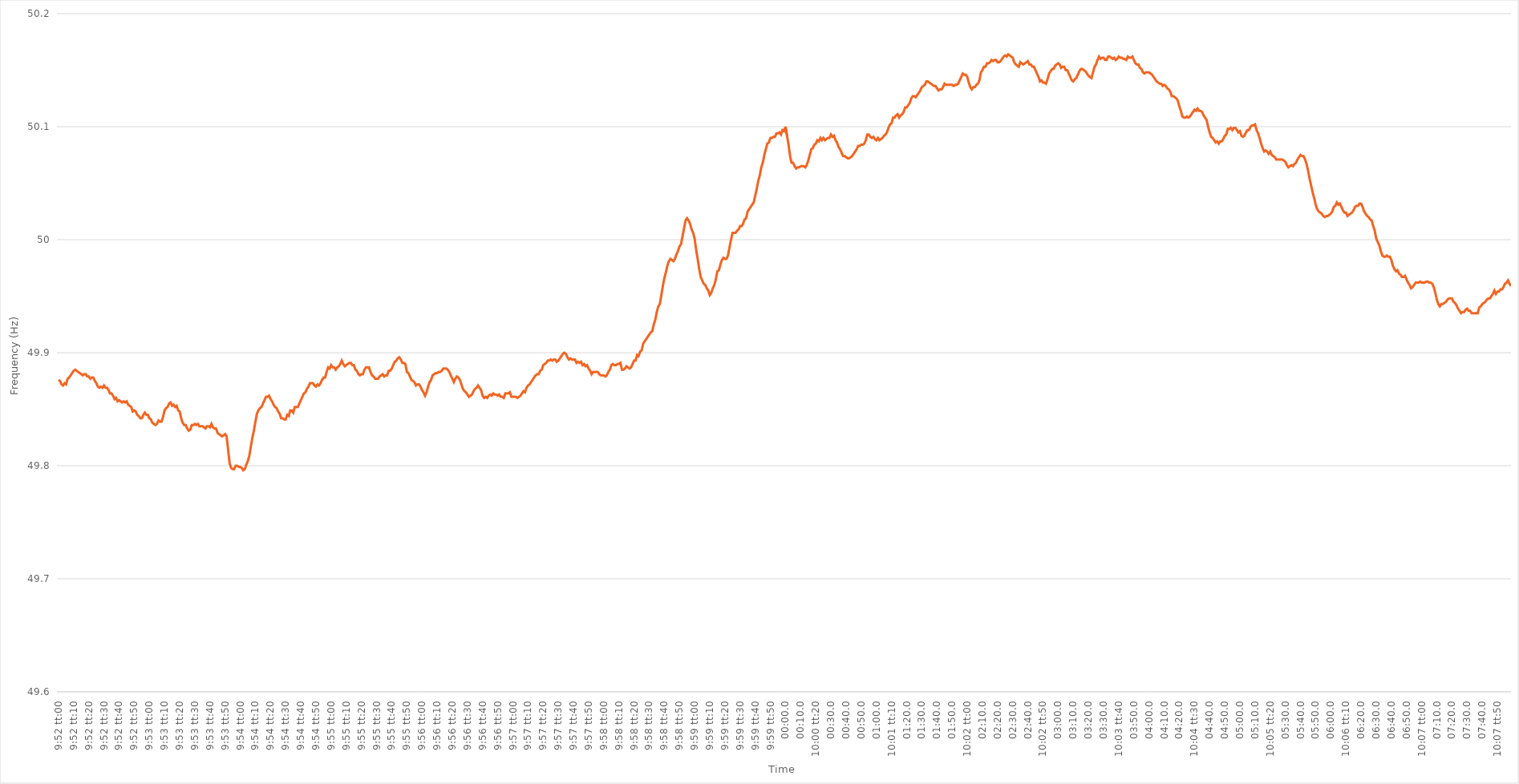
| Category | Series 0 |
|---|---|
| 0.41111111111111115 | 49.876 |
| 0.4111226851851852 | 49.875 |
| 0.4111342592592593 | 49.872 |
| 0.4111458333333333 | 49.871 |
| 0.4111574074074074 | 49.873 |
| 0.41116898148148145 | 49.872 |
| 0.4111805555555556 | 49.877 |
| 0.41119212962962964 | 49.878 |
| 0.41120370370370374 | 49.88 |
| 0.4112152777777778 | 49.882 |
| 0.4112268518518518 | 49.884 |
| 0.4112384259259259 | 49.885 |
| 0.41124999999999995 | 49.884 |
| 0.4112615740740741 | 49.883 |
| 0.41127314814814814 | 49.882 |
| 0.41128472222222223 | 49.881 |
| 0.41129629629629627 | 49.88 |
| 0.41130787037037037 | 49.881 |
| 0.4113194444444444 | 49.881 |
| 0.41133101851851855 | 49.879 |
| 0.4113425925925926 | 49.879 |
| 0.4113541666666667 | 49.877 |
| 0.4113657407407407 | 49.878 |
| 0.4113773148148148 | 49.878 |
| 0.41138888888888886 | 49.875 |
| 0.411400462962963 | 49.873 |
| 0.41141203703703705 | 49.87 |
| 0.41142361111111114 | 49.869 |
| 0.4114351851851852 | 49.87 |
| 0.4114467592592593 | 49.869 |
| 0.4114583333333333 | 49.871 |
| 0.41146990740740735 | 49.869 |
| 0.4114814814814815 | 49.869 |
| 0.41149305555555554 | 49.867 |
| 0.41150462962962964 | 49.864 |
| 0.4115162037037037 | 49.864 |
| 0.41152777777777777 | 49.862 |
| 0.4115393518518518 | 49.859 |
| 0.41155092592592596 | 49.86 |
| 0.4115625 | 49.857 |
| 0.4115740740740741 | 49.858 |
| 0.41158564814814813 | 49.857 |
| 0.4115972222222222 | 49.856 |
| 0.41160879629629626 | 49.857 |
| 0.4116203703703704 | 49.856 |
| 0.41163194444444445 | 49.857 |
| 0.41164351851851855 | 49.854 |
| 0.4116550925925926 | 49.853 |
| 0.4116666666666667 | 49.852 |
| 0.4116782407407407 | 49.848 |
| 0.41168981481481487 | 49.849 |
| 0.4117013888888889 | 49.848 |
| 0.41171296296296295 | 49.845 |
| 0.41172453703703704 | 49.844 |
| 0.4117361111111111 | 49.842 |
| 0.4117476851851852 | 49.842 |
| 0.4117592592592592 | 49.845 |
| 0.41177083333333336 | 49.847 |
| 0.4117824074074074 | 49.845 |
| 0.4117939814814815 | 49.845 |
| 0.41180555555555554 | 49.842 |
| 0.41181712962962963 | 49.841 |
| 0.41182870370370367 | 49.838 |
| 0.4118402777777778 | 49.837 |
| 0.41185185185185186 | 49.836 |
| 0.41186342592592595 | 49.837 |
| 0.411875 | 49.84 |
| 0.4118865740740741 | 49.839 |
| 0.4118981481481481 | 49.839 |
| 0.4119097222222223 | 49.843 |
| 0.4119212962962963 | 49.849 |
| 0.41193287037037035 | 49.851 |
| 0.41194444444444445 | 49.852 |
| 0.4119560185185185 | 49.855 |
| 0.4119675925925926 | 49.856 |
| 0.4119791666666666 | 49.853 |
| 0.41199074074074077 | 49.854 |
| 0.4120023148148148 | 49.852 |
| 0.4120138888888889 | 49.853 |
| 0.41202546296296294 | 49.849 |
| 0.41203703703703703 | 49.848 |
| 0.4120486111111111 | 49.842 |
| 0.4120601851851852 | 49.838 |
| 0.41207175925925926 | 49.836 |
| 0.41208333333333336 | 49.836 |
| 0.4120949074074074 | 49.833 |
| 0.4121064814814815 | 49.831 |
| 0.41211805555555553 | 49.832 |
| 0.4121296296296297 | 49.836 |
| 0.4121412037037037 | 49.836 |
| 0.4121527777777778 | 49.837 |
| 0.41216435185185185 | 49.836 |
| 0.4121759259259259 | 49.837 |
| 0.4121875 | 49.835 |
| 0.412199074074074 | 49.835 |
| 0.4122106481481482 | 49.835 |
| 0.4122222222222222 | 49.834 |
| 0.4122337962962963 | 49.833 |
| 0.41224537037037035 | 49.835 |
| 0.41225694444444444 | 49.835 |
| 0.4122685185185185 | 49.834 |
| 0.41228009259259263 | 49.837 |
| 0.41229166666666667 | 49.834 |
| 0.41230324074074076 | 49.833 |
| 0.4123148148148148 | 49.833 |
| 0.4123263888888889 | 49.829 |
| 0.41233796296296293 | 49.828 |
| 0.4123495370370371 | 49.827 |
| 0.4123611111111111 | 49.826 |
| 0.4123726851851852 | 49.827 |
| 0.41238425925925926 | 49.828 |
| 0.41239583333333335 | 49.826 |
| 0.4124074074074074 | 49.814 |
| 0.41241898148148143 | 49.802 |
| 0.4124305555555556 | 49.798 |
| 0.4124421296296296 | 49.797 |
| 0.4124537037037037 | 49.797 |
| 0.41246527777777775 | 49.8 |
| 0.41247685185185184 | 49.8 |
| 0.4124884259259259 | 49.799 |
| 0.41250000000000003 | 49.799 |
| 0.41251157407407407 | 49.798 |
| 0.41252314814814817 | 49.796 |
| 0.4125347222222222 | 49.797 |
| 0.4125462962962963 | 49.801 |
| 0.41255787037037034 | 49.804 |
| 0.4125694444444445 | 49.809 |
| 0.4125810185185185 | 49.817 |
| 0.4125925925925926 | 49.825 |
| 0.41260416666666666 | 49.831 |
| 0.41261574074074076 | 49.839 |
| 0.4126273148148148 | 49.846 |
| 0.41263888888888894 | 49.849 |
| 0.412650462962963 | 49.851 |
| 0.412662037037037 | 49.852 |
| 0.4126736111111111 | 49.855 |
| 0.41268518518518515 | 49.858 |
| 0.41269675925925925 | 49.861 |
| 0.4127083333333333 | 49.861 |
| 0.41271990740740744 | 49.862 |
| 0.4127314814814815 | 49.859 |
| 0.41274305555555557 | 49.857 |
| 0.4127546296296296 | 49.854 |
| 0.4127662037037037 | 49.852 |
| 0.41277777777777774 | 49.851 |
| 0.4127893518518519 | 49.848 |
| 0.41280092592592593 | 49.846 |
| 0.4128125 | 49.842 |
| 0.41282407407407407 | 49.842 |
| 0.41283564814814816 | 49.841 |
| 0.4128472222222222 | 49.841 |
| 0.41285879629629635 | 49.845 |
| 0.4128703703703704 | 49.844 |
| 0.4128819444444444 | 49.849 |
| 0.4128935185185185 | 49.849 |
| 0.41290509259259256 | 49.847 |
| 0.41291666666666665 | 49.852 |
| 0.4129282407407407 | 49.852 |
| 0.41293981481481484 | 49.852 |
| 0.4129513888888889 | 49.855 |
| 0.412962962962963 | 49.858 |
| 0.412974537037037 | 49.861 |
| 0.4129861111111111 | 49.864 |
| 0.41299768518518515 | 49.865 |
| 0.4130092592592593 | 49.868 |
| 0.41302083333333334 | 49.87 |
| 0.41303240740740743 | 49.873 |
| 0.41304398148148147 | 49.873 |
| 0.41305555555555556 | 49.873 |
| 0.4130671296296296 | 49.871 |
| 0.41307870370370375 | 49.87 |
| 0.4130902777777778 | 49.872 |
| 0.4131018518518519 | 49.871 |
| 0.4131134259259259 | 49.873 |
| 0.41312499999999996 | 49.876 |
| 0.41313657407407406 | 49.878 |
| 0.4131481481481481 | 49.878 |
| 0.41315972222222225 | 49.883 |
| 0.4131712962962963 | 49.887 |
| 0.4131828703703704 | 49.886 |
| 0.4131944444444444 | 49.889 |
| 0.4132060185185185 | 49.887 |
| 0.41321759259259255 | 49.887 |
| 0.4132291666666667 | 49.885 |
| 0.41324074074074074 | 49.887 |
| 0.41325231481481484 | 49.888 |
| 0.4132638888888889 | 49.89 |
| 0.41327546296296297 | 49.893 |
| 0.413287037037037 | 49.89 |
| 0.41329861111111116 | 49.888 |
| 0.4133101851851852 | 49.889 |
| 0.4133217592592593 | 49.89 |
| 0.41333333333333333 | 49.891 |
| 0.4133449074074074 | 49.891 |
| 0.41335648148148146 | 49.889 |
| 0.4133680555555555 | 49.889 |
| 0.41337962962962965 | 49.885 |
| 0.4133912037037037 | 49.884 |
| 0.4134027777777778 | 49.881 |
| 0.4134143518518518 | 49.88 |
| 0.4134259259259259 | 49.881 |
| 0.41343749999999996 | 49.881 |
| 0.4134490740740741 | 49.885 |
| 0.41346064814814815 | 49.887 |
| 0.41347222222222224 | 49.887 |
| 0.4134837962962963 | 49.887 |
| 0.4134953703703704 | 49.883 |
| 0.4135069444444444 | 49.88 |
| 0.41351851851851856 | 49.879 |
| 0.4135300925925926 | 49.877 |
| 0.4135416666666667 | 49.877 |
| 0.41355324074074074 | 49.877 |
| 0.41356481481481483 | 49.879 |
| 0.41357638888888887 | 49.88 |
| 0.413587962962963 | 49.881 |
| 0.41359953703703706 | 49.879 |
| 0.4136111111111111 | 49.88 |
| 0.4136226851851852 | 49.88 |
| 0.41363425925925923 | 49.884 |
| 0.4136458333333333 | 49.884 |
| 0.41365740740740736 | 49.886 |
| 0.4136689814814815 | 49.889 |
| 0.41368055555555555 | 49.892 |
| 0.41369212962962965 | 49.893 |
| 0.4137037037037037 | 49.895 |
| 0.4137152777777778 | 49.896 |
| 0.4137268518518518 | 49.894 |
| 0.41373842592592597 | 49.891 |
| 0.41375 | 49.891 |
| 0.4137615740740741 | 49.89 |
| 0.41377314814814814 | 49.883 |
| 0.41378472222222223 | 49.882 |
| 0.4137962962962963 | 49.879 |
| 0.4138078703703704 | 49.876 |
| 0.41381944444444446 | 49.875 |
| 0.4138310185185185 | 49.874 |
| 0.4138425925925926 | 49.871 |
| 0.41385416666666663 | 49.872 |
| 0.41386574074074073 | 49.872 |
| 0.41387731481481477 | 49.87 |
| 0.4138888888888889 | 49.867 |
| 0.41390046296296296 | 49.865 |
| 0.41391203703703705 | 49.862 |
| 0.4139236111111111 | 49.865 |
| 0.4139351851851852 | 49.87 |
| 0.4139467592592592 | 49.874 |
| 0.4139583333333334 | 49.876 |
| 0.4139699074074074 | 49.88 |
| 0.4139814814814815 | 49.881 |
| 0.41399305555555554 | 49.882 |
| 0.41400462962962964 | 49.882 |
| 0.4140162037037037 | 49.883 |
| 0.41402777777777783 | 49.883 |
| 0.41403935185185187 | 49.884 |
| 0.41405092592592596 | 49.886 |
| 0.4140625 | 49.886 |
| 0.41407407407407404 | 49.886 |
| 0.41408564814814813 | 49.885 |
| 0.41409722222222217 | 49.883 |
| 0.4141087962962963 | 49.88 |
| 0.41412037037037036 | 49.877 |
| 0.41413194444444446 | 49.874 |
| 0.4141435185185185 | 49.877 |
| 0.4141550925925926 | 49.879 |
| 0.4141666666666666 | 49.878 |
| 0.4141782407407408 | 49.876 |
| 0.4141898148148148 | 49.872 |
| 0.4142013888888889 | 49.868 |
| 0.41421296296296295 | 49.866 |
| 0.41422453703703704 | 49.865 |
| 0.4142361111111111 | 49.863 |
| 0.41424768518518523 | 49.861 |
| 0.41425925925925927 | 49.862 |
| 0.41427083333333337 | 49.863 |
| 0.4142824074074074 | 49.866 |
| 0.4142939814814815 | 49.868 |
| 0.41430555555555554 | 49.869 |
| 0.4143171296296296 | 49.871 |
| 0.4143287037037037 | 49.869 |
| 0.41434027777777777 | 49.867 |
| 0.41435185185185186 | 49.862 |
| 0.4143634259259259 | 49.86 |
| 0.414375 | 49.861 |
| 0.41438657407407403 | 49.86 |
| 0.4143981481481482 | 49.862 |
| 0.4144097222222222 | 49.863 |
| 0.4144212962962963 | 49.862 |
| 0.41443287037037035 | 49.864 |
| 0.41444444444444445 | 49.863 |
| 0.4144560185185185 | 49.863 |
| 0.41446759259259264 | 49.862 |
| 0.4144791666666667 | 49.863 |
| 0.41449074074074077 | 49.861 |
| 0.4145023148148148 | 49.861 |
| 0.4145138888888889 | 49.86 |
| 0.41452546296296294 | 49.864 |
| 0.414537037037037 | 49.864 |
| 0.41454861111111113 | 49.864 |
| 0.41456018518518517 | 49.865 |
| 0.41457175925925926 | 49.861 |
| 0.4145833333333333 | 49.861 |
| 0.4145949074074074 | 49.861 |
| 0.41460648148148144 | 49.861 |
| 0.4146180555555556 | 49.86 |
| 0.4146296296296296 | 49.861 |
| 0.4146412037037037 | 49.862 |
| 0.41465277777777776 | 49.864 |
| 0.41466435185185185 | 49.866 |
| 0.4146759259259259 | 49.865 |
| 0.41468750000000004 | 49.869 |
| 0.4146990740740741 | 49.871 |
| 0.4147106481481482 | 49.872 |
| 0.4147222222222222 | 49.874 |
| 0.4147337962962963 | 49.876 |
| 0.41474537037037035 | 49.878 |
| 0.4147569444444445 | 49.88 |
| 0.41476851851851854 | 49.881 |
| 0.4147800925925926 | 49.881 |
| 0.41479166666666667 | 49.884 |
| 0.4148032407407407 | 49.885 |
| 0.4148148148148148 | 49.889 |
| 0.41482638888888884 | 49.89 |
| 0.414837962962963 | 49.891 |
| 0.41484953703703703 | 49.893 |
| 0.4148611111111111 | 49.893 |
| 0.41487268518518516 | 49.894 |
| 0.41488425925925926 | 49.893 |
| 0.4148958333333333 | 49.894 |
| 0.41490740740740745 | 49.894 |
| 0.4149189814814815 | 49.892 |
| 0.4149305555555556 | 49.893 |
| 0.4149421296296296 | 49.895 |
| 0.4149537037037037 | 49.897 |
| 0.41496527777777775 | 49.899 |
| 0.4149768518518519 | 49.9 |
| 0.41498842592592594 | 49.899 |
| 0.41500000000000004 | 49.896 |
| 0.4150115740740741 | 49.894 |
| 0.4150231481481481 | 49.895 |
| 0.4150347222222222 | 49.894 |
| 0.41504629629629625 | 49.894 |
| 0.4150578703703704 | 49.894 |
| 0.41506944444444444 | 49.891 |
| 0.41508101851851853 | 49.892 |
| 0.41509259259259257 | 49.891 |
| 0.41510416666666666 | 49.892 |
| 0.4151157407407407 | 49.889 |
| 0.41512731481481485 | 49.89 |
| 0.4151388888888889 | 49.888 |
| 0.415150462962963 | 49.889 |
| 0.415162037037037 | 49.886 |
| 0.4151736111111111 | 49.884 |
| 0.41518518518518516 | 49.881 |
| 0.4151967592592593 | 49.883 |
| 0.41520833333333335 | 49.883 |
| 0.41521990740740744 | 49.883 |
| 0.4152314814814815 | 49.883 |
| 0.4152430555555556 | 49.881 |
| 0.4152546296296296 | 49.88 |
| 0.41526620370370365 | 49.88 |
| 0.4152777777777778 | 49.88 |
| 0.41528935185185184 | 49.879 |
| 0.41530092592592593 | 49.88 |
| 0.4153125 | 49.883 |
| 0.41532407407407407 | 49.885 |
| 0.4153356481481481 | 49.889 |
| 0.41534722222222226 | 49.89 |
| 0.4153587962962963 | 49.889 |
| 0.4153703703703704 | 49.889 |
| 0.41538194444444443 | 49.89 |
| 0.4153935185185185 | 49.89 |
| 0.41540509259259256 | 49.891 |
| 0.4154166666666667 | 49.885 |
| 0.41542824074074075 | 49.885 |
| 0.41543981481481485 | 49.886 |
| 0.4154513888888889 | 49.888 |
| 0.415462962962963 | 49.887 |
| 0.415474537037037 | 49.886 |
| 0.41548611111111106 | 49.887 |
| 0.4154976851851852 | 49.89 |
| 0.41550925925925924 | 49.893 |
| 0.41552083333333334 | 49.893 |
| 0.4155324074074074 | 49.898 |
| 0.4155439814814815 | 49.897 |
| 0.4155555555555555 | 49.901 |
| 0.41556712962962966 | 49.902 |
| 0.4155787037037037 | 49.908 |
| 0.4155902777777778 | 49.91 |
| 0.41560185185185183 | 49.912 |
| 0.41561342592592593 | 49.914 |
| 0.41562499999999997 | 49.916 |
| 0.4156365740740741 | 49.918 |
| 0.41564814814814816 | 49.919 |
| 0.41565972222222225 | 49.925 |
| 0.4156712962962963 | 49.929 |
| 0.4156828703703704 | 49.936 |
| 0.4156944444444444 | 49.941 |
| 0.41570601851851857 | 49.943 |
| 0.4157175925925926 | 49.951 |
| 0.41572916666666665 | 49.959 |
| 0.41574074074074074 | 49.966 |
| 0.4157523148148148 | 49.971 |
| 0.4157638888888889 | 49.977 |
| 0.4157754629629629 | 49.981 |
| 0.41578703703703707 | 49.983 |
| 0.4157986111111111 | 49.982 |
| 0.4158101851851852 | 49.981 |
| 0.41582175925925924 | 49.983 |
| 0.41583333333333333 | 49.987 |
| 0.41584490740740737 | 49.99 |
| 0.4158564814814815 | 49.994 |
| 0.41586805555555556 | 49.996 |
| 0.41587962962962965 | 50.003 |
| 0.4158912037037037 | 50.01 |
| 0.4159027777777778 | 50.017 |
| 0.4159143518518518 | 50.019 |
| 0.415925925925926 | 50.017 |
| 0.4159375 | 50.014 |
| 0.4159490740740741 | 50.009 |
| 0.41596064814814815 | 50.006 |
| 0.4159722222222222 | 50.001 |
| 0.4159837962962963 | 49.991 |
| 0.4159953703703703 | 49.983 |
| 0.41600694444444447 | 49.974 |
| 0.4160185185185185 | 49.967 |
| 0.4160300925925926 | 49.964 |
| 0.41604166666666664 | 49.961 |
| 0.41605324074074074 | 49.96 |
| 0.4160648148148148 | 49.957 |
| 0.4160763888888889 | 49.955 |
| 0.41608796296296297 | 49.951 |
| 0.41609953703703706 | 49.953 |
| 0.4161111111111111 | 49.957 |
| 0.4161226851851852 | 49.96 |
| 0.41613425925925923 | 49.965 |
| 0.4161458333333334 | 49.972 |
| 0.4161574074074074 | 49.973 |
| 0.4161689814814815 | 49.978 |
| 0.41618055555555555 | 49.982 |
| 0.41619212962962965 | 49.984 |
| 0.4162037037037037 | 49.983 |
| 0.4162152777777777 | 49.983 |
| 0.4162268518518519 | 49.986 |
| 0.4162384259259259 | 49.993 |
| 0.41625 | 50 |
| 0.41626157407407405 | 50.006 |
| 0.41627314814814814 | 50.006 |
| 0.4162847222222222 | 50.006 |
| 0.41629629629629633 | 50.008 |
| 0.41630787037037037 | 50.009 |
| 0.41631944444444446 | 50.012 |
| 0.4163310185185185 | 50.012 |
| 0.4163425925925926 | 50.014 |
| 0.41635416666666664 | 50.018 |
| 0.4163657407407408 | 50.019 |
| 0.4163773148148148 | 50.025 |
| 0.4163888888888889 | 50.027 |
| 0.41640046296296296 | 50.029 |
| 0.41641203703703705 | 50.031 |
| 0.4164236111111111 | 50.033 |
| 0.41643518518518513 | 50.039 |
| 0.4164467592592593 | 50.045 |
| 0.4164583333333333 | 50.052 |
| 0.4164699074074074 | 50.057 |
| 0.41648148148148145 | 50.064 |
| 0.41649305555555555 | 50.068 |
| 0.4165046296296296 | 50.075 |
| 0.41651620370370374 | 50.08 |
| 0.4165277777777778 | 50.085 |
| 0.41653935185185187 | 50.086 |
| 0.4165509259259259 | 50.09 |
| 0.4165625 | 50.09 |
| 0.41657407407407404 | 50.091 |
| 0.4165856481481482 | 50.091 |
| 0.41659722222222223 | 50.094 |
| 0.4166087962962963 | 50.094 |
| 0.41662037037037036 | 50.095 |
| 0.41663194444444446 | 50.093 |
| 0.4166435185185185 | 50.097 |
| 0.41665509259259265 | 50.096 |
| 0.4166666666666667 | 50.1 |
| 0.4166782407407407 | 50.092 |
| 0.4166898148148148 | 50.084 |
| 0.41670138888888886 | 50.074 |
| 0.41671296296296295 | 50.068 |
| 0.416724537037037 | 50.068 |
| 0.41673611111111114 | 50.065 |
| 0.4167476851851852 | 50.063 |
| 0.4167592592592593 | 50.064 |
| 0.4167708333333333 | 50.064 |
| 0.4167824074074074 | 50.065 |
| 0.41679398148148145 | 50.065 |
| 0.4168055555555556 | 50.065 |
| 0.41681712962962963 | 50.064 |
| 0.41682870370370373 | 50.066 |
| 0.41684027777777777 | 50.07 |
| 0.41685185185185186 | 50.075 |
| 0.4168634259259259 | 50.08 |
| 0.41687500000000005 | 50.081 |
| 0.4168865740740741 | 50.084 |
| 0.4168981481481482 | 50.085 |
| 0.4169097222222222 | 50.088 |
| 0.41692129629629626 | 50.087 |
| 0.41693287037037036 | 50.09 |
| 0.4169444444444444 | 50.088 |
| 0.41695601851851855 | 50.09 |
| 0.4169675925925926 | 50.088 |
| 0.4169791666666667 | 50.089 |
| 0.4169907407407407 | 50.09 |
| 0.4170023148148148 | 50.09 |
| 0.41701388888888885 | 50.093 |
| 0.417025462962963 | 50.091 |
| 0.41703703703703704 | 50.092 |
| 0.41704861111111113 | 50.088 |
| 0.4170601851851852 | 50.086 |
| 0.41707175925925927 | 50.082 |
| 0.4170833333333333 | 50.08 |
| 0.41709490740740746 | 50.077 |
| 0.4171064814814815 | 50.074 |
| 0.4171180555555556 | 50.074 |
| 0.41712962962962963 | 50.073 |
| 0.41714120370370367 | 50.072 |
| 0.41715277777777776 | 50.072 |
| 0.4171643518518518 | 50.073 |
| 0.41717592592592595 | 50.074 |
| 0.4171875 | 50.076 |
| 0.4171990740740741 | 50.078 |
| 0.4172106481481481 | 50.08 |
| 0.4172222222222222 | 50.083 |
| 0.41723379629629626 | 50.083 |
| 0.4172453703703704 | 50.084 |
| 0.41725694444444444 | 50.084 |
| 0.41726851851851854 | 50.085 |
| 0.4172800925925926 | 50.088 |
| 0.41729166666666667 | 50.093 |
| 0.4173032407407407 | 50.093 |
| 0.41731481481481486 | 50.091 |
| 0.4173263888888889 | 50.09 |
| 0.417337962962963 | 50.091 |
| 0.41734953703703703 | 50.089 |
| 0.4173611111111111 | 50.088 |
| 0.41737268518518517 | 50.09 |
| 0.4173842592592592 | 50.088 |
| 0.41739583333333335 | 50.089 |
| 0.4174074074074074 | 50.09 |
| 0.4174189814814815 | 50.092 |
| 0.4174305555555555 | 50.093 |
| 0.4174421296296296 | 50.095 |
| 0.41745370370370366 | 50.099 |
| 0.4174652777777778 | 50.102 |
| 0.41747685185185185 | 50.103 |
| 0.41748842592592594 | 50.108 |
| 0.4175 | 50.108 |
| 0.4175115740740741 | 50.11 |
| 0.4175231481481481 | 50.111 |
| 0.41753472222222227 | 50.108 |
| 0.4175462962962963 | 50.11 |
| 0.4175578703703704 | 50.111 |
| 0.41756944444444444 | 50.113 |
| 0.41758101851851853 | 50.117 |
| 0.41759259259259257 | 50.117 |
| 0.4176041666666667 | 50.119 |
| 0.41761574074074076 | 50.121 |
| 0.4176273148148148 | 50.125 |
| 0.4176388888888889 | 50.127 |
| 0.41765046296296293 | 50.127 |
| 0.417662037037037 | 50.126 |
| 0.41767361111111106 | 50.128 |
| 0.4176851851851852 | 50.13 |
| 0.41769675925925925 | 50.132 |
| 0.41770833333333335 | 50.135 |
| 0.4177199074074074 | 50.136 |
| 0.4177314814814815 | 50.137 |
| 0.4177430555555555 | 50.14 |
| 0.41775462962962967 | 50.14 |
| 0.4177662037037037 | 50.139 |
| 0.4177777777777778 | 50.138 |
| 0.41778935185185184 | 50.137 |
| 0.41780092592592594 | 50.136 |
| 0.4178125 | 50.136 |
| 0.4178240740740741 | 50.134 |
| 0.41783564814814816 | 50.132 |
| 0.41784722222222226 | 50.133 |
| 0.4178587962962963 | 50.133 |
| 0.41787037037037034 | 50.135 |
| 0.41788194444444443 | 50.138 |
| 0.41789351851851847 | 50.137 |
| 0.4179050925925926 | 50.137 |
| 0.41791666666666666 | 50.137 |
| 0.41792824074074075 | 50.137 |
| 0.4179398148148148 | 50.137 |
| 0.4179513888888889 | 50.136 |
| 0.4179629629629629 | 50.137 |
| 0.4179745370370371 | 50.137 |
| 0.4179861111111111 | 50.138 |
| 0.4179976851851852 | 50.141 |
| 0.41800925925925925 | 50.144 |
| 0.41802083333333334 | 50.147 |
| 0.4180324074074074 | 50.146 |
| 0.41804398148148153 | 50.146 |
| 0.41805555555555557 | 50.144 |
| 0.41806712962962966 | 50.139 |
| 0.4180787037037037 | 50.135 |
| 0.41809027777777774 | 50.133 |
| 0.41810185185185184 | 50.135 |
| 0.4181134259259259 | 50.135 |
| 0.418125 | 50.137 |
| 0.41813657407407406 | 50.138 |
| 0.41814814814814816 | 50.141 |
| 0.4181597222222222 | 50.148 |
| 0.4181712962962963 | 50.15 |
| 0.41818287037037033 | 50.153 |
| 0.4181944444444445 | 50.153 |
| 0.4182060185185185 | 50.156 |
| 0.4182175925925926 | 50.156 |
| 0.41822916666666665 | 50.157 |
| 0.41824074074074075 | 50.159 |
| 0.4182523148148148 | 50.158 |
| 0.41826388888888894 | 50.159 |
| 0.418275462962963 | 50.159 |
| 0.41828703703703707 | 50.157 |
| 0.4182986111111111 | 50.157 |
| 0.4183101851851852 | 50.158 |
| 0.41832175925925924 | 50.16 |
| 0.4183333333333333 | 50.162 |
| 0.41834490740740743 | 50.163 |
| 0.41835648148148147 | 50.162 |
| 0.41836805555555556 | 50.164 |
| 0.4183796296296296 | 50.163 |
| 0.4183912037037037 | 50.162 |
| 0.41840277777777773 | 50.161 |
| 0.4184143518518519 | 50.157 |
| 0.4184259259259259 | 50.155 |
| 0.4184375 | 50.154 |
| 0.41844907407407406 | 50.153 |
| 0.41846064814814815 | 50.157 |
| 0.4184722222222222 | 50.156 |
| 0.41848379629629634 | 50.155 |
| 0.4184953703703704 | 50.156 |
| 0.4185069444444445 | 50.157 |
| 0.4185185185185185 | 50.158 |
| 0.4185300925925926 | 50.155 |
| 0.41854166666666665 | 50.155 |
| 0.4185532407407408 | 50.153 |
| 0.41856481481481483 | 50.153 |
| 0.4185763888888889 | 50.15 |
| 0.41858796296296297 | 50.147 |
| 0.418599537037037 | 50.144 |
| 0.4186111111111111 | 50.14 |
| 0.41862268518518514 | 50.141 |
| 0.4186342592592593 | 50.139 |
| 0.41864583333333333 | 50.139 |
| 0.4186574074074074 | 50.138 |
| 0.41866898148148146 | 50.142 |
| 0.41868055555555556 | 50.147 |
| 0.4186921296296296 | 50.149 |
| 0.41870370370370374 | 50.151 |
| 0.4187152777777778 | 50.151 |
| 0.4187268518518519 | 50.154 |
| 0.4187384259259259 | 50.155 |
| 0.41875 | 50.156 |
| 0.41876157407407405 | 50.155 |
| 0.4187731481481482 | 50.152 |
| 0.41878472222222224 | 50.153 |
| 0.41879629629629633 | 50.153 |
| 0.41880787037037037 | 50.15 |
| 0.4188194444444444 | 50.15 |
| 0.4188310185185185 | 50.147 |
| 0.41884259259259254 | 50.144 |
| 0.4188541666666667 | 50.141 |
| 0.41886574074074073 | 50.14 |
| 0.4188773148148148 | 50.142 |
| 0.41888888888888887 | 50.143 |
| 0.41890046296296296 | 50.146 |
| 0.418912037037037 | 50.149 |
| 0.41892361111111115 | 50.151 |
| 0.4189351851851852 | 50.151 |
| 0.4189467592592593 | 50.15 |
| 0.4189583333333333 | 50.149 |
| 0.4189699074074074 | 50.147 |
| 0.41898148148148145 | 50.145 |
| 0.4189930555555556 | 50.144 |
| 0.41900462962962964 | 50.143 |
| 0.41901620370370374 | 50.148 |
| 0.4190277777777778 | 50.153 |
| 0.4190393518518518 | 50.155 |
| 0.4190509259259259 | 50.159 |
| 0.41906249999999995 | 50.162 |
| 0.4190740740740741 | 50.16 |
| 0.41908564814814814 | 50.161 |
| 0.41909722222222223 | 50.161 |
| 0.41910879629629627 | 50.159 |
| 0.41912037037037037 | 50.159 |
| 0.4191319444444444 | 50.162 |
| 0.41914351851851855 | 50.162 |
| 0.4191550925925926 | 50.161 |
| 0.4191666666666667 | 50.16 |
| 0.4191782407407407 | 50.161 |
| 0.4191898148148148 | 50.159 |
| 0.41920138888888886 | 50.16 |
| 0.419212962962963 | 50.162 |
| 0.41922453703703705 | 50.161 |
| 0.41923611111111114 | 50.161 |
| 0.4192476851851852 | 50.16 |
| 0.4192592592592593 | 50.16 |
| 0.4192708333333333 | 50.159 |
| 0.41928240740740735 | 50.162 |
| 0.4192939814814815 | 50.161 |
| 0.41930555555555554 | 50.161 |
| 0.41931712962962964 | 50.162 |
| 0.4193287037037037 | 50.159 |
| 0.41934027777777777 | 50.156 |
| 0.4193518518518518 | 50.155 |
| 0.41936342592592596 | 50.155 |
| 0.419375 | 50.152 |
| 0.4193865740740741 | 50.151 |
| 0.41939814814814813 | 50.148 |
| 0.4194097222222222 | 50.147 |
| 0.41942129629629626 | 50.148 |
| 0.4194328703703704 | 50.148 |
| 0.41944444444444445 | 50.148 |
| 0.41945601851851855 | 50.147 |
| 0.4194675925925926 | 50.146 |
| 0.4194791666666667 | 50.144 |
| 0.4194907407407407 | 50.142 |
| 0.41950231481481487 | 50.14 |
| 0.4195138888888889 | 50.139 |
| 0.41952546296296295 | 50.138 |
| 0.41953703703703704 | 50.138 |
| 0.4195486111111111 | 50.136 |
| 0.4195601851851852 | 50.137 |
| 0.4195717592592592 | 50.136 |
| 0.41958333333333336 | 50.134 |
| 0.4195949074074074 | 50.133 |
| 0.4196064814814815 | 50.131 |
| 0.41961805555555554 | 50.127 |
| 0.41962962962962963 | 50.127 |
| 0.41964120370370367 | 50.126 |
| 0.4196527777777778 | 50.125 |
| 0.41966435185185186 | 50.123 |
| 0.41967592592592595 | 50.118 |
| 0.4196875 | 50.114 |
| 0.4196990740740741 | 50.109 |
| 0.4197106481481481 | 50.108 |
| 0.4197222222222223 | 50.108 |
| 0.4197337962962963 | 50.109 |
| 0.41974537037037035 | 50.108 |
| 0.41975694444444445 | 50.109 |
| 0.4197685185185185 | 50.111 |
| 0.4197800925925926 | 50.113 |
| 0.4197916666666666 | 50.115 |
| 0.41980324074074077 | 50.114 |
| 0.4198148148148148 | 50.116 |
| 0.4198263888888889 | 50.114 |
| 0.41983796296296294 | 50.114 |
| 0.41984953703703703 | 50.113 |
| 0.4198611111111111 | 50.11 |
| 0.4198726851851852 | 50.108 |
| 0.41988425925925926 | 50.106 |
| 0.41989583333333336 | 50.1 |
| 0.4199074074074074 | 50.095 |
| 0.4199189814814815 | 50.091 |
| 0.41993055555555553 | 50.09 |
| 0.4199421296296297 | 50.088 |
| 0.4199537037037037 | 50.086 |
| 0.4199652777777778 | 50.087 |
| 0.41997685185185185 | 50.085 |
| 0.4199884259259259 | 50.087 |
| 0.42 | 50.087 |
| 0.420011574074074 | 50.089 |
| 0.4200231481481482 | 50.092 |
| 0.4200347222222222 | 50.093 |
| 0.4200462962962963 | 50.098 |
| 0.42005787037037035 | 50.098 |
| 0.42006944444444444 | 50.099 |
| 0.4200810185185185 | 50.097 |
| 0.42009259259259263 | 50.099 |
| 0.42010416666666667 | 50.099 |
| 0.42011574074074076 | 50.097 |
| 0.4201273148148148 | 50.095 |
| 0.4201388888888889 | 50.096 |
| 0.42015046296296293 | 50.092 |
| 0.4201620370370371 | 50.091 |
| 0.4201736111111111 | 50.092 |
| 0.4201851851851852 | 50.095 |
| 0.42019675925925926 | 50.097 |
| 0.42020833333333335 | 50.097 |
| 0.4202199074074074 | 50.1 |
| 0.42023148148148143 | 50.101 |
| 0.4202430555555556 | 50.101 |
| 0.4202546296296296 | 50.102 |
| 0.4202662037037037 | 50.097 |
| 0.42027777777777775 | 50.094 |
| 0.42028935185185184 | 50.09 |
| 0.4203009259259259 | 50.085 |
| 0.42031250000000003 | 50.081 |
| 0.42032407407407407 | 50.078 |
| 0.42033564814814817 | 50.079 |
| 0.4203472222222222 | 50.078 |
| 0.4203587962962963 | 50.076 |
| 0.42037037037037034 | 50.078 |
| 0.4203819444444445 | 50.075 |
| 0.4203935185185185 | 50.074 |
| 0.4204050925925926 | 50.073 |
| 0.42041666666666666 | 50.071 |
| 0.42042824074074076 | 50.071 |
| 0.4204398148148148 | 50.071 |
| 0.42045138888888894 | 50.071 |
| 0.420462962962963 | 50.071 |
| 0.420474537037037 | 50.07 |
| 0.4204861111111111 | 50.069 |
| 0.42049768518518515 | 50.066 |
| 0.42050925925925925 | 50.064 |
| 0.4205208333333333 | 50.065 |
| 0.42053240740740744 | 50.066 |
| 0.4205439814814815 | 50.065 |
| 0.42055555555555557 | 50.067 |
| 0.4205671296296296 | 50.068 |
| 0.4205787037037037 | 50.071 |
| 0.42059027777777774 | 50.073 |
| 0.4206018518518519 | 50.075 |
| 0.42061342592592593 | 50.074 |
| 0.420625 | 50.074 |
| 0.42063657407407407 | 50.071 |
| 0.42064814814814816 | 50.067 |
| 0.4206597222222222 | 50.061 |
| 0.42067129629629635 | 50.054 |
| 0.4206828703703704 | 50.048 |
| 0.4206944444444444 | 50.042 |
| 0.4207060185185185 | 50.037 |
| 0.42071759259259256 | 50.031 |
| 0.42072916666666665 | 50.027 |
| 0.4207407407407407 | 50.025 |
| 0.42075231481481484 | 50.024 |
| 0.4207638888888889 | 50.023 |
| 0.420775462962963 | 50.021 |
| 0.420787037037037 | 50.02 |
| 0.4207986111111111 | 50.021 |
| 0.42081018518518515 | 50.021 |
| 0.4208217592592593 | 50.022 |
| 0.42083333333333334 | 50.023 |
| 0.42084490740740743 | 50.025 |
| 0.42085648148148147 | 50.029 |
| 0.42086805555555556 | 50.03 |
| 0.4208796296296296 | 50.033 |
| 0.42089120370370375 | 50.031 |
| 0.4209027777777778 | 50.032 |
| 0.4209143518518519 | 50.029 |
| 0.4209259259259259 | 50.026 |
| 0.42093749999999996 | 50.024 |
| 0.42094907407407406 | 50.024 |
| 0.4209606481481481 | 50.021 |
| 0.42097222222222225 | 50.022 |
| 0.4209837962962963 | 50.023 |
| 0.4209953703703704 | 50.024 |
| 0.4210069444444444 | 50.026 |
| 0.4210185185185185 | 50.029 |
| 0.42103009259259255 | 50.03 |
| 0.4210416666666667 | 50.03 |
| 0.42105324074074074 | 50.032 |
| 0.42106481481481484 | 50.032 |
| 0.4210763888888889 | 50.029 |
| 0.42108796296296297 | 50.025 |
| 0.421099537037037 | 50.023 |
| 0.42111111111111116 | 50.021 |
| 0.4211226851851852 | 50.02 |
| 0.4211342592592593 | 50.018 |
| 0.42114583333333333 | 50.017 |
| 0.4211574074074074 | 50.012 |
| 0.42116898148148146 | 50.008 |
| 0.4211805555555555 | 50.001 |
| 0.42119212962962965 | 49.998 |
| 0.4212037037037037 | 49.995 |
| 0.4212152777777778 | 49.99 |
| 0.4212268518518518 | 49.986 |
| 0.4212384259259259 | 49.985 |
| 0.42124999999999996 | 49.985 |
| 0.4212615740740741 | 49.986 |
| 0.42127314814814815 | 49.985 |
| 0.42128472222222224 | 49.985 |
| 0.4212962962962963 | 49.982 |
| 0.4213078703703704 | 49.977 |
| 0.4213194444444444 | 49.974 |
| 0.42133101851851856 | 49.972 |
| 0.4213425925925926 | 49.973 |
| 0.4213541666666667 | 49.97 |
| 0.42136574074074074 | 49.969 |
| 0.42137731481481483 | 49.967 |
| 0.42138888888888887 | 49.967 |
| 0.421400462962963 | 49.968 |
| 0.42141203703703706 | 49.965 |
| 0.4214236111111111 | 49.962 |
| 0.4214351851851852 | 49.96 |
| 0.42144675925925923 | 49.957 |
| 0.4214583333333333 | 49.958 |
| 0.42146990740740736 | 49.96 |
| 0.4214814814814815 | 49.962 |
| 0.42149305555555555 | 49.962 |
| 0.42150462962962965 | 49.962 |
| 0.4215162037037037 | 49.963 |
| 0.4215277777777778 | 49.962 |
| 0.4215393518518518 | 49.962 |
| 0.42155092592592597 | 49.962 |
| 0.4215625 | 49.963 |
| 0.4215740740740741 | 49.963 |
| 0.42158564814814814 | 49.962 |
| 0.42159722222222223 | 49.962 |
| 0.4216087962962963 | 49.961 |
| 0.4216203703703704 | 49.958 |
| 0.42163194444444446 | 49.953 |
| 0.4216435185185185 | 49.947 |
| 0.4216550925925926 | 49.943 |
| 0.42166666666666663 | 49.941 |
| 0.42167824074074073 | 49.943 |
| 0.42168981481481477 | 49.943 |
| 0.4217013888888889 | 49.944 |
| 0.42171296296296296 | 49.945 |
| 0.42172453703703705 | 49.947 |
| 0.4217361111111111 | 49.948 |
| 0.4217476851851852 | 49.948 |
| 0.4217592592592592 | 49.948 |
| 0.4217708333333334 | 49.945 |
| 0.4217824074074074 | 49.944 |
| 0.4217939814814815 | 49.942 |
| 0.42180555555555554 | 49.939 |
| 0.42181712962962964 | 49.937 |
| 0.4218287037037037 | 49.935 |
| 0.42184027777777783 | 49.936 |
| 0.42185185185185187 | 49.936 |
| 0.42186342592592596 | 49.938 |
| 0.421875 | 49.939 |
| 0.42188657407407404 | 49.937 |
| 0.42189814814814813 | 49.937 |
| 0.42190972222222217 | 49.935 |
| 0.4219212962962963 | 49.935 |
| 0.42193287037037036 | 49.935 |
| 0.42194444444444446 | 49.935 |
| 0.4219560185185185 | 49.935 |
| 0.4219675925925926 | 49.94 |
| 0.4219791666666666 | 49.941 |
| 0.4219907407407408 | 49.943 |
| 0.4220023148148148 | 49.944 |
| 0.4220138888888889 | 49.945 |
| 0.42202546296296295 | 49.947 |
| 0.42203703703703704 | 49.948 |
| 0.4220486111111111 | 49.948 |
| 0.42206018518518523 | 49.95 |
| 0.42207175925925927 | 49.952 |
| 0.42208333333333337 | 49.955 |
| 0.4220949074074074 | 49.952 |
| 0.4221064814814815 | 49.954 |
| 0.42211805555555554 | 49.954 |
| 0.4221296296296296 | 49.956 |
| 0.4221412037037037 | 49.956 |
| 0.42215277777777777 | 49.958 |
| 0.42216435185185186 | 49.961 |
| 0.4221759259259259 | 49.962 |
| 0.4221875 | 49.964 |
| 0.42219907407407403 | 49.961 |
| 0.4222106481481482 | 49.959 |